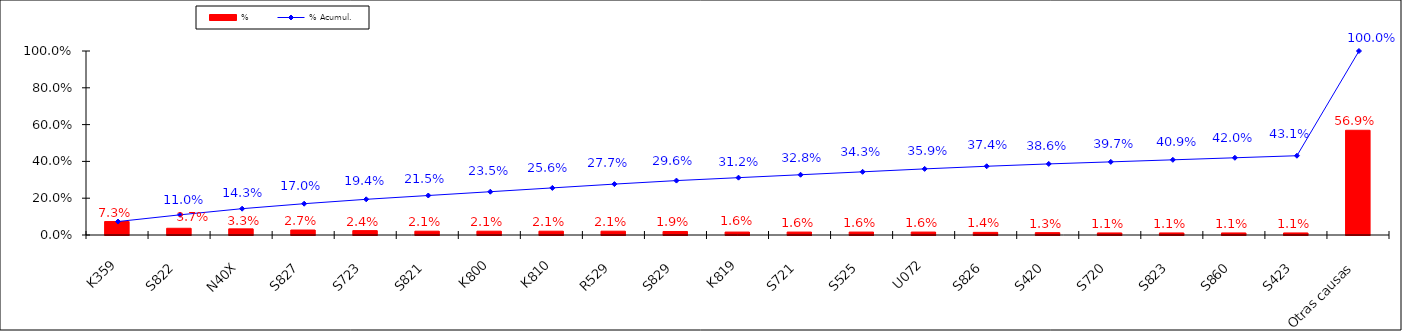
| Category | % |
|---|---|
| K359 | 0.073 |
| S822 | 0.037 |
| N40X | 0.033 |
| S827 | 0.027 |
| S723 | 0.024 |
| S821 | 0.021 |
| K800 | 0.021 |
| K810 | 0.021 |
| R529 | 0.021 |
| S829 | 0.019 |
| K819 | 0.016 |
| S721 | 0.016 |
| S525 | 0.016 |
| U072 | 0.016 |
| S826 | 0.014 |
| S420 | 0.013 |
| S720 | 0.011 |
| S823 | 0.011 |
| S860 | 0.011 |
| S423 | 0.011 |
| Otras causas | 0.569 |